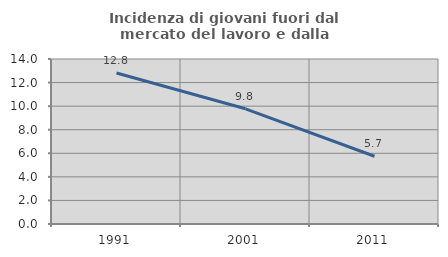
| Category | Incidenza di giovani fuori dal mercato del lavoro e dalla formazione  |
|---|---|
| 1991.0 | 12.81 |
| 2001.0 | 9.776 |
| 2011.0 | 5.749 |